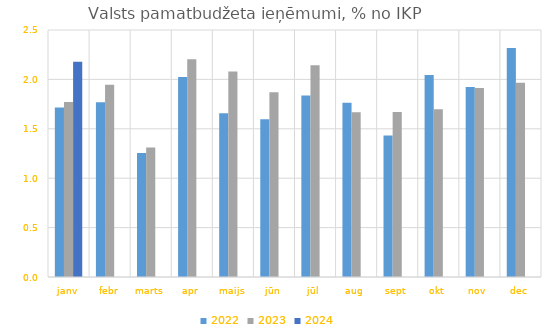
| Category | 2022 | 2023 | 2024 |
|---|---|---|---|
| janv | 1.715 | 1.771 | 2.178 |
| febr | 1.769 | 1.947 | 0 |
| marts | 1.254 | 1.312 | 0 |
| apr | 2.025 | 2.204 | 0 |
| maijs | 1.657 | 2.079 | 0 |
| jūn | 1.596 | 1.87 | 0 |
| jūl | 1.837 | 2.144 | 0 |
| aug | 1.762 | 1.668 | 0 |
| sept | 1.431 | 1.669 | 0 |
| okt | 2.043 | 1.697 | 0 |
| nov | 1.924 | 1.912 | 0 |
| dec | 2.318 | 1.966 | 0 |